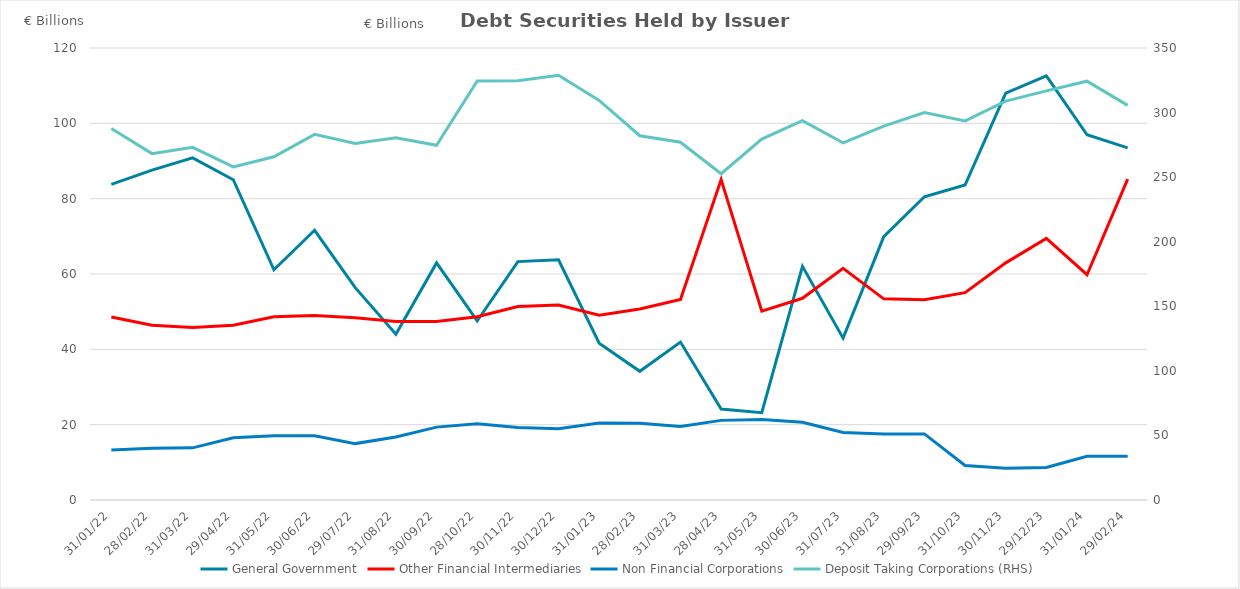
| Category | General Government | Other Financial Intermediaries | Non Financial Corporations |
|---|---|---|---|
| 2022-01-31 | 83.795 | 48.578 | 13.243 |
| 2022-02-28 | 87.582 | 46.39 | 13.771 |
| 2022-03-31 | 90.84 | 45.781 | 13.841 |
| 2022-04-29 | 85.033 | 46.398 | 16.497 |
| 2022-05-31 | 61.12 | 48.621 | 17.055 |
| 2022-06-30 | 71.613 | 48.983 | 17.08 |
| 2022-07-29 | 56.366 | 48.41 | 14.973 |
| 2022-08-31 | 44.033 | 47.374 | 16.747 |
| 2022-09-30 | 62.942 | 47.368 | 19.35 |
| 2022-10-28 | 47.526 | 48.643 | 20.217 |
| 2022-11-30 | 63.288 | 51.388 | 19.222 |
| 2022-12-30 | 63.785 | 51.765 | 18.912 |
| 2023-01-31 | 41.639 | 49.074 | 20.453 |
| 2023-02-28 | 34.164 | 50.702 | 20.392 |
| 2023-03-31 | 41.933 | 53.268 | 19.501 |
| 2023-04-28 | 24.128 | 85.071 | 21.14 |
| 2023-05-31 | 23.19 | 50.155 | 21.391 |
| 2023-06-30 | 62.05 | 53.548 | 20.652 |
| 2023-07-31 | 42.972 | 61.521 | 17.919 |
| 2023-08-31 | 69.911 | 53.397 | 17.544 |
| 2023-09-29 | 80.515 | 53.164 | 17.541 |
| 2023-10-31 | 83.624 | 55.054 | 9.176 |
| 2023-11-30 | 108.02 | 62.96 | 8.423 |
| 2023-12-29 | 112.617 | 69.449 | 8.623 |
| 2024-01-31 | 96.967 | 59.81 | 11.619 |
| 2024-02-29 | 93.494 | 85.2 | 11.622 |